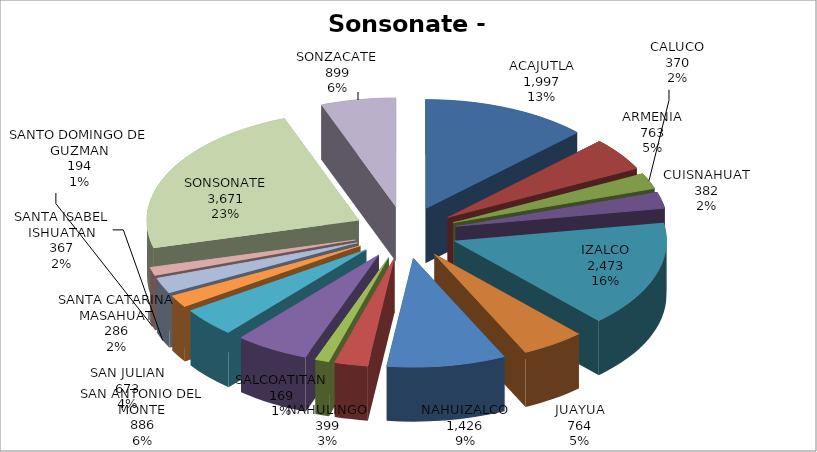
| Category | Series 0 |
|---|---|
| ACAJUTLA | 1997 |
| ARMENIA | 763 |
| CALUCO | 370 |
| CUISNAHUAT | 382 |
| IZALCO | 2473 |
| JUAYUA | 764 |
| NAHUIZALCO | 1426 |
| NAHULINGO | 399 |
| SALCOATITAN | 169 |
| SAN ANTONIO DEL MONTE | 886 |
| SAN JULIAN | 673 |
| SANTA CATARINA MASAHUAT | 286 |
| SANTA ISABEL ISHUATAN | 367 |
| SANTO DOMINGO DE GUZMAN | 194 |
| SONSONATE | 3671 |
| SONZACATE | 899 |